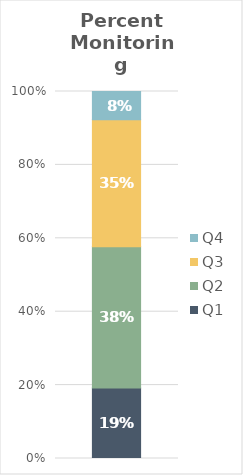
| Category | Q1 | Q2 | Q3 | Q4 |
|---|---|---|---|---|
| Total | 0.192 | 0.385 | 0.346 | 0.077 |